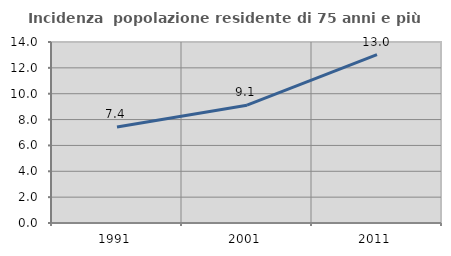
| Category | Incidenza  popolazione residente di 75 anni e più |
|---|---|
| 1991.0 | 7.431 |
| 2001.0 | 9.114 |
| 2011.0 | 13.02 |